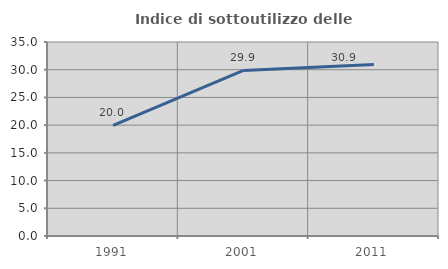
| Category | Indice di sottoutilizzo delle abitazioni  |
|---|---|
| 1991.0 | 19.972 |
| 2001.0 | 29.88 |
| 2011.0 | 30.919 |